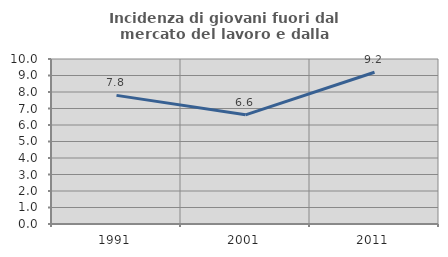
| Category | Incidenza di giovani fuori dal mercato del lavoro e dalla formazione  |
|---|---|
| 1991.0 | 7.796 |
| 2001.0 | 6.617 |
| 2011.0 | 9.199 |